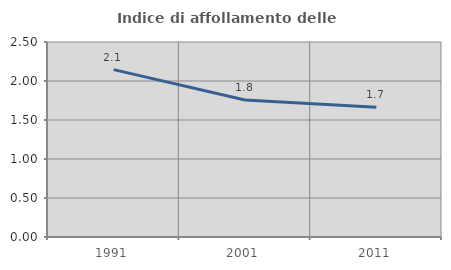
| Category | Indice di affollamento delle abitazioni  |
|---|---|
| 1991.0 | 2.146 |
| 2001.0 | 1.757 |
| 2011.0 | 1.662 |